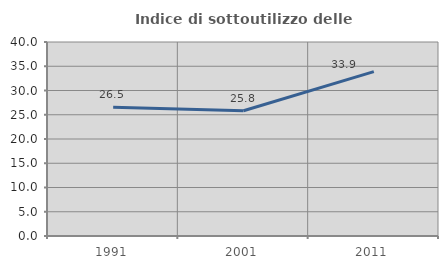
| Category | Indice di sottoutilizzo delle abitazioni  |
|---|---|
| 1991.0 | 26.54 |
| 2001.0 | 25.822 |
| 2011.0 | 33.898 |